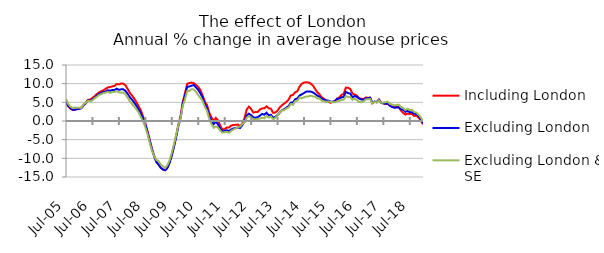
| Category | Including London | Excluding London | Excluding London & SE |
|---|---|---|---|
| 2005-07-01 | 4.929 | 5.234 | 5.912 |
| 2005-08-01 | 3.904 | 4.11 | 4.579 |
| 2005-09-01 | 3.307 | 3.467 | 3.845 |
| 2005-10-01 | 2.983 | 3.057 | 3.504 |
| 2005-11-01 | 2.97 | 3.027 | 3.61 |
| 2005-12-01 | 3.282 | 3.163 | 3.554 |
| 2006-01-01 | 3.392 | 3.23 | 3.526 |
| 2006-02-01 | 3.661 | 3.384 | 3.507 |
| 2006-03-01 | 4.324 | 4.241 | 4.508 |
| 2006-04-01 | 4.937 | 4.745 | 4.889 |
| 2006-05-01 | 5.692 | 5.5 | 5.409 |
| 2006-06-01 | 5.74 | 5.391 | 5.297 |
| 2006-07-01 | 6.189 | 5.833 | 5.562 |
| 2006-08-01 | 6.652 | 6.246 | 6.111 |
| 2006-09-01 | 7.224 | 6.766 | 6.471 |
| 2006-10-01 | 7.66 | 7.279 | 6.993 |
| 2006-11-01 | 7.994 | 7.519 | 7.201 |
| 2006-12-01 | 8.229 | 7.714 | 7.454 |
| 2007-01-01 | 8.608 | 7.898 | 7.611 |
| 2007-02-01 | 9.011 | 8.213 | 7.807 |
| 2007-03-01 | 9.08 | 8.094 | 7.535 |
| 2007-04-01 | 9.295 | 8.304 | 7.716 |
| 2007-05-01 | 9.388 | 8.306 | 7.832 |
| 2007-06-01 | 9.907 | 8.66 | 7.966 |
| 2007-07-01 | 9.788 | 8.343 | 7.697 |
| 2007-08-01 | 10.057 | 8.482 | 7.582 |
| 2007-09-01 | 10.004 | 8.485 | 7.621 |
| 2007-10-01 | 9.547 | 8.05 | 7.097 |
| 2007-11-01 | 8.556 | 7.262 | 6.242 |
| 2007-12-01 | 7.513 | 6.355 | 5.285 |
| 2008-01-01 | 6.804 | 5.702 | 4.489 |
| 2008-02-01 | 5.949 | 4.882 | 3.861 |
| 2008-03-01 | 4.981 | 4.03 | 3.108 |
| 2008-04-01 | 3.926 | 3.04 | 2.268 |
| 2008-05-01 | 2.778 | 1.996 | 1.026 |
| 2008-06-01 | 1.183 | 0.603 | -0.123 |
| 2008-07-01 | -0.603 | -0.964 | -1.66 |
| 2008-08-01 | -2.766 | -3.011 | -3.518 |
| 2008-09-01 | -5.136 | -5.317 | -5.868 |
| 2008-10-01 | -7.399 | -7.61 | -7.927 |
| 2008-11-01 | -9.296 | -9.441 | -9.326 |
| 2008-12-01 | -10.78 | -11.022 | -10.45 |
| 2009-01-01 | -11.611 | -11.692 | -10.714 |
| 2009-02-01 | -12.508 | -12.526 | -11.659 |
| 2009-03-01 | -13.003 | -12.983 | -12.112 |
| 2009-04-01 | -13.206 | -13.181 | -12.62 |
| 2009-05-01 | -12.458 | -12.581 | -11.826 |
| 2009-06-01 | -11.081 | -11.188 | -10.551 |
| 2009-07-01 | -9.049 | -9.241 | -8.491 |
| 2009-08-01 | -6.731 | -6.878 | -6.239 |
| 2009-09-01 | -3.878 | -4.304 | -3.732 |
| 2009-10-01 | -0.95 | -1.35 | -1.078 |
| 2009-11-01 | 1.436 | 0.841 | 0.812 |
| 2009-12-01 | 5.087 | 4.677 | 4.051 |
| 2010-01-01 | 7.476 | 6.847 | 5.855 |
| 2010-02-01 | 9.957 | 9.158 | 8.026 |
| 2010-03-01 | 10.187 | 9.249 | 8.046 |
| 2010-04-01 | 10.293 | 9.464 | 8.539 |
| 2010-05-01 | 10.134 | 9.636 | 8.443 |
| 2010-06-01 | 9.686 | 8.974 | 7.819 |
| 2010-07-01 | 9.13 | 8.344 | 6.927 |
| 2010-08-01 | 8.277 | 7.375 | 6.148 |
| 2010-09-01 | 6.825 | 6.297 | 5.38 |
| 2010-10-01 | 5.198 | 4.562 | 3.81 |
| 2010-11-01 | 4.242 | 3.499 | 2.719 |
| 2010-12-01 | 2.222 | 1.247 | 0.588 |
| 2011-01-01 | 0.939 | 0.042 | -0.777 |
| 2011-02-01 | 0.059 | -0.86 | -1.827 |
| 2011-03-01 | 0.819 | -0.208 | -1.448 |
| 2011-04-01 | 0.169 | -0.876 | -1.735 |
| 2011-05-01 | -1.249 | -2.089 | -2.594 |
| 2011-06-01 | -2.327 | -2.799 | -3.113 |
| 2011-07-01 | -2.111 | -2.68 | -2.984 |
| 2011-08-01 | -1.734 | -2.479 | -2.912 |
| 2011-09-01 | -1.719 | -2.708 | -3.153 |
| 2011-10-01 | -1.214 | -2.257 | -2.603 |
| 2011-11-01 | -1.069 | -1.996 | -2.263 |
| 2011-12-01 | -1.035 | -1.886 | -1.981 |
| 2012-01-01 | -0.955 | -1.72 | -1.646 |
| 2012-02-01 | -1.387 | -1.875 | -1.499 |
| 2012-03-01 | -0.651 | -1.096 | -0.794 |
| 2012-04-01 | 0.731 | -0.125 | -0.376 |
| 2012-05-01 | 3.09 | 1.481 | 0.883 |
| 2012-06-01 | 3.853 | 1.977 | 1.347 |
| 2012-07-01 | 3.236 | 1.571 | 0.934 |
| 2012-08-01 | 2.256 | 0.937 | 0.481 |
| 2012-09-01 | 2.394 | 0.888 | 0.351 |
| 2012-10-01 | 2.437 | 1.034 | 0.539 |
| 2012-11-01 | 3.088 | 1.426 | 0.672 |
| 2012-12-01 | 3.374 | 1.912 | 0.837 |
| 2013-01-01 | 3.401 | 1.699 | 0.715 |
| 2013-02-01 | 3.923 | 2.206 | 1.359 |
| 2013-03-01 | 3.418 | 1.52 | 0.906 |
| 2013-04-01 | 3.278 | 1.644 | 1.225 |
| 2013-05-01 | 2.166 | 0.851 | 0.404 |
| 2013-06-01 | 2.285 | 1.099 | 0.851 |
| 2013-07-01 | 2.753 | 1.602 | 1.473 |
| 2013-08-01 | 3.667 | 2.247 | 2.226 |
| 2013-09-01 | 4.2 | 2.86 | 2.912 |
| 2013-10-01 | 4.672 | 3.129 | 2.875 |
| 2013-11-01 | 5.097 | 3.584 | 3.376 |
| 2013-12-01 | 5.734 | 3.954 | 3.609 |
| 2014-01-01 | 6.843 | 4.907 | 4.542 |
| 2014-02-01 | 6.983 | 4.965 | 4.317 |
| 2014-03-01 | 7.681 | 5.847 | 5.343 |
| 2014-04-01 | 8.001 | 6.044 | 5.45 |
| 2014-05-01 | 9.211 | 6.845 | 6.326 |
| 2014-06-01 | 9.998 | 7.125 | 6.115 |
| 2014-07-01 | 10.284 | 7.494 | 6.334 |
| 2014-08-01 | 10.371 | 7.86 | 6.56 |
| 2014-09-01 | 10.314 | 7.927 | 6.564 |
| 2014-10-01 | 10.032 | 7.894 | 6.813 |
| 2014-11-01 | 9.522 | 7.679 | 6.573 |
| 2014-12-01 | 8.631 | 7.277 | 6.549 |
| 2015-01-01 | 7.731 | 6.813 | 6.058 |
| 2015-02-01 | 7.186 | 6.505 | 6.026 |
| 2015-03-01 | 6.343 | 5.977 | 5.483 |
| 2015-04-01 | 6.022 | 5.732 | 5.304 |
| 2015-05-01 | 5.4 | 5.522 | 5.107 |
| 2015-06-01 | 5.119 | 5.447 | 5.233 |
| 2015-07-01 | 4.895 | 5.208 | 5.134 |
| 2015-08-01 | 5.145 | 5.128 | 5.054 |
| 2015-09-01 | 5.313 | 5.319 | 4.994 |
| 2015-10-01 | 6.033 | 5.873 | 5.273 |
| 2015-11-01 | 6.276 | 5.999 | 5.404 |
| 2015-12-01 | 6.992 | 6.339 | 5.631 |
| 2016-01-01 | 7.254 | 6.427 | 5.715 |
| 2016-02-01 | 8.952 | 7.83 | 6.69 |
| 2016-03-01 | 8.888 | 7.448 | 6.427 |
| 2016-04-01 | 8.591 | 7.359 | 6.427 |
| 2016-05-01 | 7.371 | 6.358 | 5.693 |
| 2016-06-01 | 7.084 | 6.666 | 5.925 |
| 2016-07-01 | 6.779 | 6.463 | 5.632 |
| 2016-08-01 | 6.064 | 6.038 | 5.085 |
| 2016-09-01 | 5.961 | 5.746 | 5.002 |
| 2016-10-01 | 5.857 | 5.668 | 5.238 |
| 2016-11-01 | 6.276 | 6.026 | 5.773 |
| 2016-12-01 | 6.237 | 6.128 | 5.852 |
| 2017-01-01 | 6.238 | 6.244 | 5.869 |
| 2017-02-01 | 4.745 | 4.862 | 4.741 |
| 2017-03-01 | 5.113 | 5.241 | 5.166 |
| 2017-04-01 | 5.088 | 5.021 | 4.922 |
| 2017-05-01 | 5.743 | 5.663 | 5.515 |
| 2017-06-01 | 4.959 | 4.834 | 4.849 |
| 2017-07-01 | 4.714 | 4.729 | 4.941 |
| 2017-08-01 | 4.526 | 4.69 | 5.043 |
| 2017-09-01 | 4.534 | 4.671 | 5.173 |
| 2017-10-01 | 4.076 | 4.08 | 4.606 |
| 2017-11-01 | 3.889 | 3.764 | 4.402 |
| 2017-12-01 | 3.852 | 3.542 | 4.179 |
| 2018-01-01 | 3.854 | 3.594 | 4.296 |
| 2018-02-01 | 3.689 | 3.686 | 4.375 |
| 2018-03-01 | 2.811 | 3.146 | 3.743 |
| 2018-04-01 | 2.145 | 3.017 | 3.518 |
| 2018-05-01 | 1.722 | 2.447 | 2.933 |
| 2018-06-01 | 2.004 | 2.757 | 3.267 |
| 2018-07-01 | 1.839 | 2.328 | 2.93 |
| 2018-08-01 | 1.897 | 2.367 | 2.978 |
| 2018-09-01 | 1.332 | 1.923 | 2.419 |
| 2018-10-01 | 1.421 | 1.879 | 2.254 |
| 2018-11-01 | 0.906 | 1.364 | 1.673 |
| 2018-12-01 | 0.102 | 0.501 | 0.972 |
| 2019-01-01 | -0.884 | -0.644 | -0.042 |